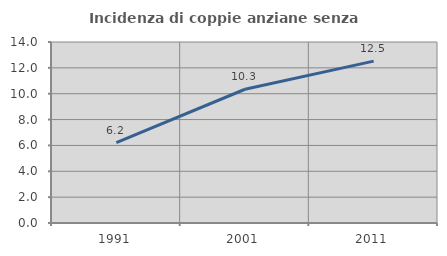
| Category | Incidenza di coppie anziane senza figli  |
|---|---|
| 1991.0 | 6.212 |
| 2001.0 | 10.345 |
| 2011.0 | 12.521 |